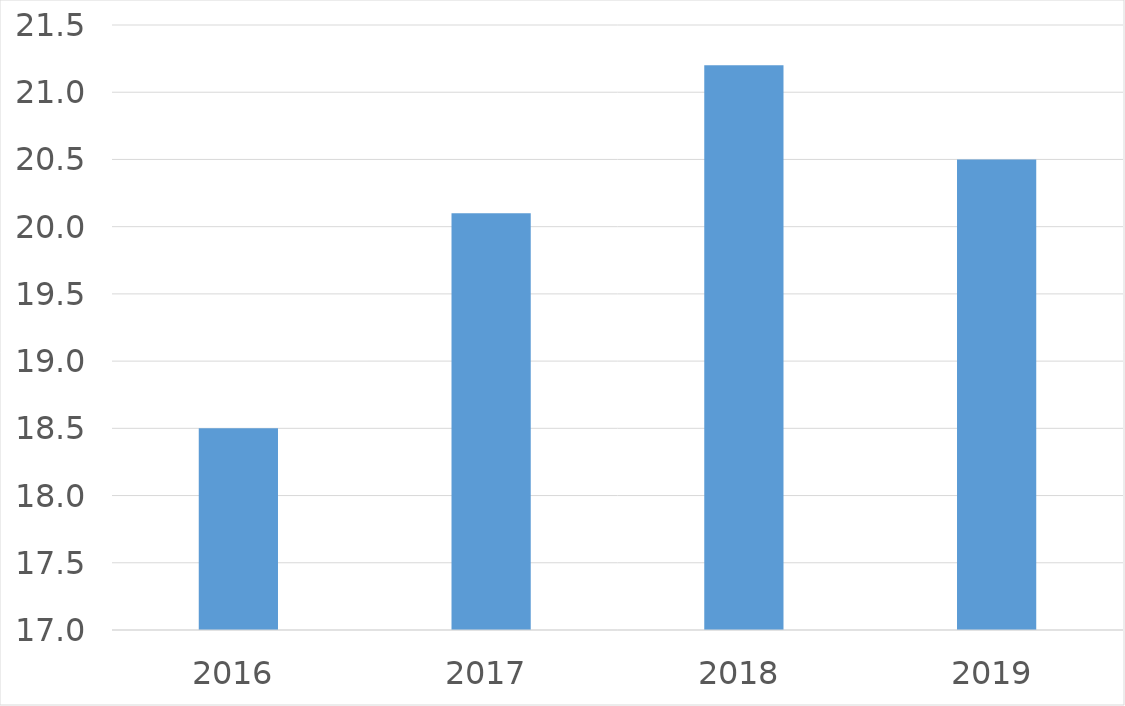
| Category | Series 0 |
|---|---|
| 2016 | 18.5 |
| 2017 | 20.1 |
| 2018 | 21.2 |
| 2019 | 20.5 |